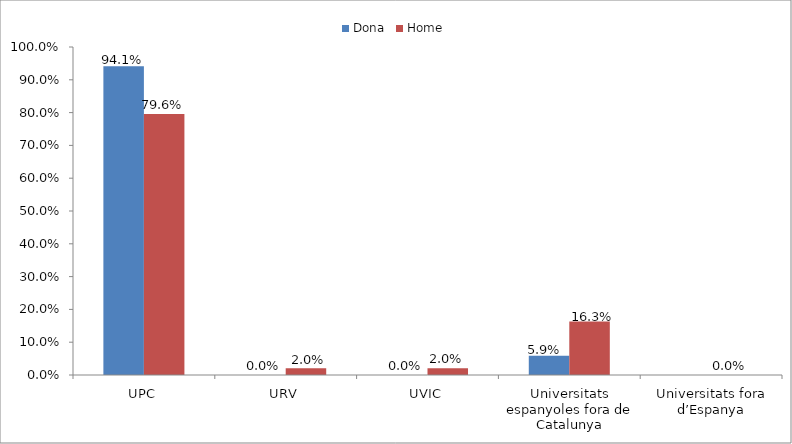
| Category | Dona | Home |
|---|---|---|
| UPC | 0.941 | 0.796 |
| URV | 0 | 0.02 |
| UVIC | 0 | 0.02 |
| Universitats espanyoles fora de Catalunya | 0.059 | 0.163 |
| Universitats fora d’Espanya | 0 | 0 |